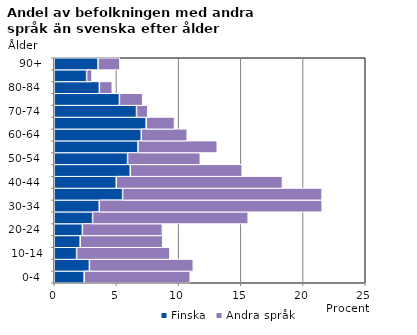
| Category | Finska | Andra språk |
|---|---|---|
|   0-4  | 2.407 | 8.523 |
|   5-9  | 2.826 | 8.354 |
| 10-14 | 1.797 | 7.497 |
| 15-19  | 2.086 | 6.637 |
| 20-24  | 2.261 | 6.431 |
| 25-29  | 3.084 | 12.507 |
| 30-34  | 3.619 | 17.921 |
| 35-39  | 5.496 | 16.034 |
| 40-44  | 4.984 | 13.362 |
| 45-49  | 6.112 | 8.999 |
| 50-54  | 5.894 | 5.846 |
| 55-59  | 6.732 | 6.37 |
| 60-64  | 6.995 | 3.695 |
| 65-69  | 7.39 | 2.274 |
| 70-74  | 6.614 | 0.91 |
| 75-79  | 5.239 | 1.871 |
| 80-84  | 3.627 | 1.036 |
| 85-89  | 2.603 | 0.434 |
| 90+ | 3.521 | 1.761 |